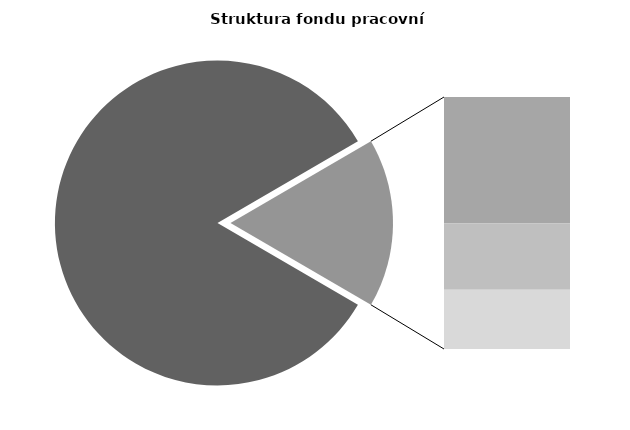
| Category | Series 0 |
|---|---|
| Průměrná měsíční odpracovaná doba bez přesčasu | 141.55 |
| Dovolená | 14.32 |
| Nemoc | 7.535 |
| Jiné | 6.703 |